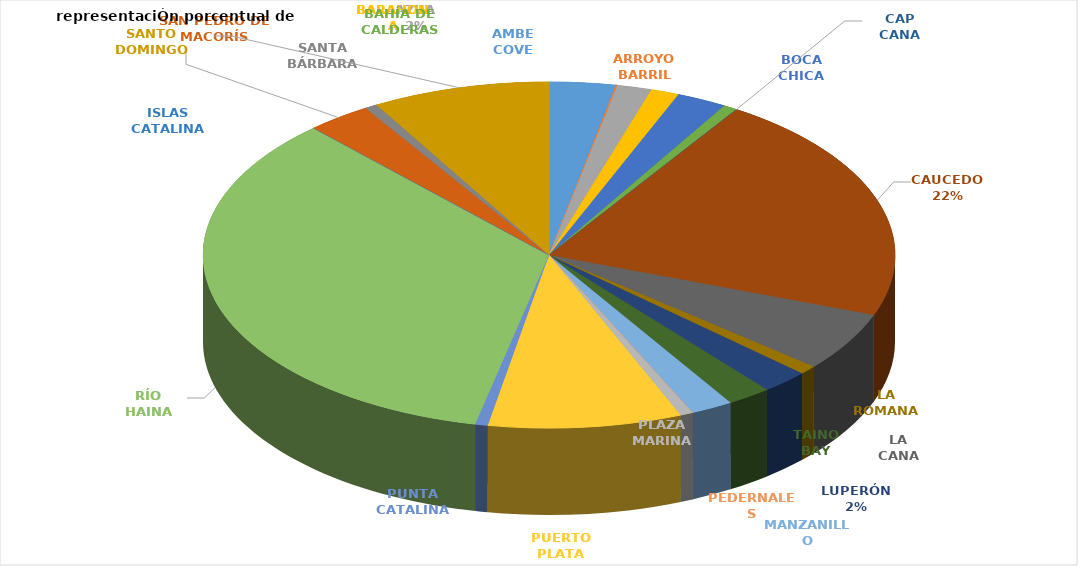
| Category | PORCENTUAL  |
|---|---|
| AMBE COVE | 0.031 |
| ARROYO BARRIL | 0.001 |
| AZUA | 0.016 |
| BARAHONA | 0.013 |
| BOCA CHICA | 0.024 |
| BAHÍA DE CALDERAS | 0.007 |
| CAP CANA | 0 |
| CAUCEDO | 0.215 |
| LA CANA | 0.055 |
| LA ROMANA | 0.008 |
| LUPERÓN  | 0.022 |
| TAINO BAY | 0.021 |
| MANZANILLO | 0.02 |
| PEDERNALES | 0 |
| PLAZA MARINA | 0.006 |
| PUERTO PLATA | 0.09 |
| PUNTA CATALINA | 0.006 |
| RÍO HAINA | 0.347 |
| ISLAS CATALINA | 0 |
| SAN PEDRO DE MACORÍS | 0.03 |
| SANTA BÁRBARA | 0.006 |
| SANTO DOMINGO | 0.083 |